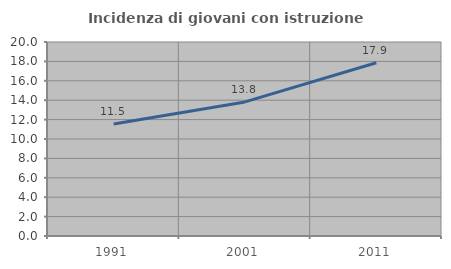
| Category | Incidenza di giovani con istruzione universitaria |
|---|---|
| 1991.0 | 11.538 |
| 2001.0 | 13.821 |
| 2011.0 | 17.857 |